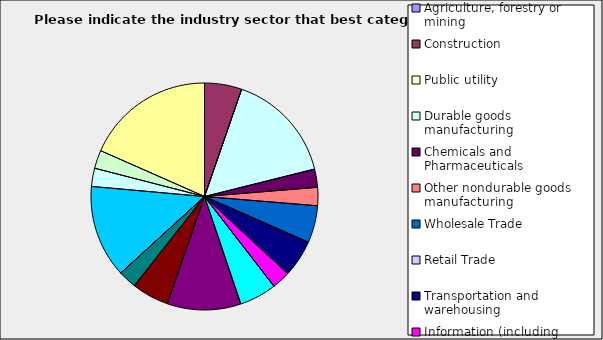
| Category | Series 0 |
|---|---|
| Agriculture, forestry or mining | 0 |
| Construction | 0.053 |
| Public utility | 0 |
| Durable goods manufacturing | 0.158 |
| Chemicals and Pharmaceuticals | 0.026 |
| Other nondurable goods manufacturing | 0.026 |
| Wholesale Trade | 0.053 |
| Retail Trade | 0 |
| Transportation and warehousing | 0.053 |
| Information (including broadcasting and telecommunication) | 0.026 |
| Finance and Insurance | 0 |
| Real Estate | 0.053 |
| Professional, scientific and technical services | 0.105 |
| Consulting | 0.053 |
| Administrative and office services (including waste management) | 0.026 |
| Education | 0 |
| Health Care and social services | 0.132 |
| Arts, entertainment and recreation | 0.026 |
| Accommodation and food services | 0.026 |
| Other | 0.184 |